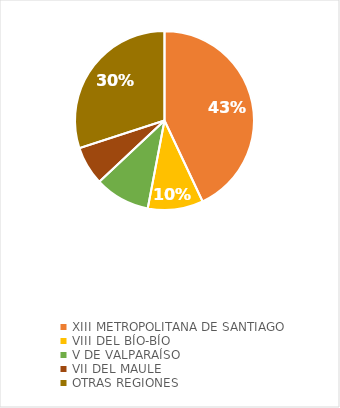
| Category | Series 0 |
|---|---|
| XIII METROPOLITANA DE SANTIAGO | 0.43 |
| VIII DEL BÍO-BÍO | 0.1 |
| V DE VALPARAÍSO | 0.1 |
| VII DEL MAULE | 0.07 |
| OTRAS REGIONES | 0.3 |